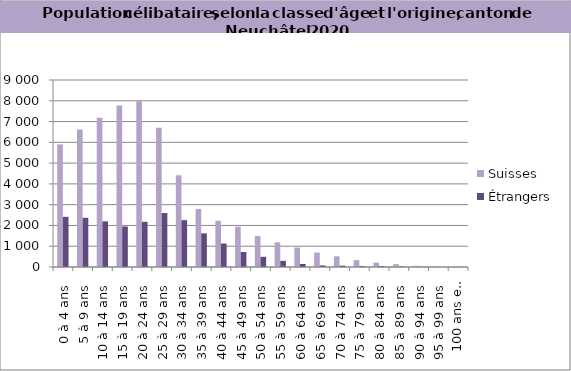
| Category | Suisses | Étrangers |
|---|---|---|
| 0 à 4 ans | 5900 | 2415 |
| 5 à 9 ans | 6612 | 2368 |
| 10 à 14 ans | 7178 | 2198 |
| 15 à 19 ans | 7768 | 1951 |
| 20 à 24 ans | 7974 | 2175 |
| 25 à 29 ans | 6697 | 2599 |
| 30 à 34 ans | 4414 | 2256 |
| 35 à 39 ans | 2794 | 1620 |
| 40 à 44 ans | 2226 | 1131 |
| 45 à 49 ans | 1940 | 723 |
| 50 à 54 ans | 1488 | 490 |
| 55 à 59 ans | 1188 | 297 |
| 60 à 64 ans | 935 | 146 |
| 65 à 69 ans | 695 | 78 |
| 70 à 74 ans | 515 | 65 |
| 75 à 79 ans | 330 | 39 |
| 80 à 84 ans | 207 | 37 |
| 85 à 89 ans | 136 | 25 |
| 90 à 94 ans | 61 | 9 |
| 95 à 99 ans | 20 | 2 |
| 100 ans et plus | 2 | 1 |